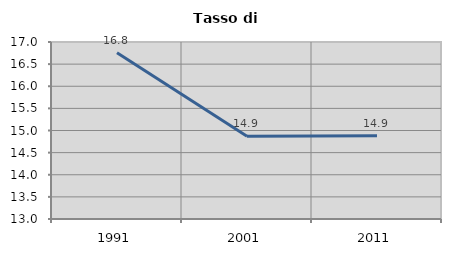
| Category | Tasso di disoccupazione   |
|---|---|
| 1991.0 | 16.757 |
| 2001.0 | 14.869 |
| 2011.0 | 14.881 |